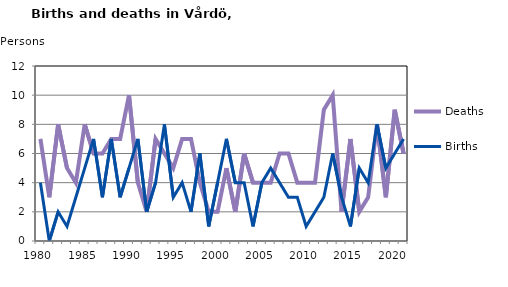
| Category | Deaths | Births |
|---|---|---|
| 1980.0 | 7 | 4 |
| 1981.0 | 3 | 0 |
| 1982.0 | 8 | 2 |
| 1983.0 | 5 | 1 |
| 1984.0 | 4 | 3 |
| 1985.0 | 8 | 5 |
| 1986.0 | 6 | 7 |
| 1987.0 | 6 | 3 |
| 1988.0 | 7 | 7 |
| 1989.0 | 7 | 3 |
| 1990.0 | 10 | 5 |
| 1991.0 | 4 | 7 |
| 1992.0 | 2 | 2 |
| 1993.0 | 7 | 4 |
| 1994.0 | 6 | 8 |
| 1995.0 | 5 | 3 |
| 1996.0 | 7 | 4 |
| 1997.0 | 7 | 2 |
| 1998.0 | 4 | 6 |
| 1999.0 | 2 | 1 |
| 2000.0 | 2 | 4 |
| 2001.0 | 5 | 7 |
| 2002.0 | 2 | 4 |
| 2003.0 | 6 | 4 |
| 2004.0 | 4 | 1 |
| 2005.0 | 4 | 4 |
| 2006.0 | 4 | 5 |
| 2007.0 | 6 | 4 |
| 2008.0 | 6 | 3 |
| 2009.0 | 4 | 3 |
| 2010.0 | 4 | 1 |
| 2011.0 | 4 | 2 |
| 2012.0 | 9 | 3 |
| 2013.0 | 10 | 6 |
| 2014.0 | 2 | 3 |
| 2015.0 | 7 | 1 |
| 2016.0 | 2 | 5 |
| 2017.0 | 3 | 4 |
| 2018.0 | 8 | 8 |
| 2019.0 | 3 | 5 |
| 2020.0 | 9 | 6 |
| 2021.0 | 6 | 7 |